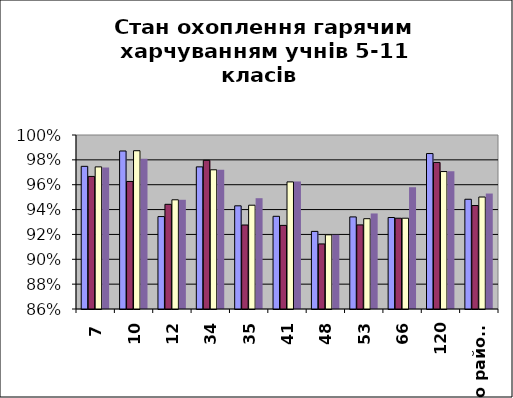
| Category | Series 0 | Series 1 | Series 2 | Series 3 |
|---|---|---|---|---|
| 7 | 0.975 | 0.967 | 0.974 | 0.974 |
| 10 | 0.987 | 0.963 | 0.987 | 0.981 |
| 12 | 0.934 | 0.944 | 0.948 | 0.948 |
| 34 | 0.974 | 0.98 | 0.972 | 0.972 |
| 35 | 0.943 | 0.928 | 0.944 | 0.949 |
| 41 | 0.935 | 0.927 | 0.962 | 0.963 |
| 48 | 0.922 | 0.912 | 0.92 | 0.92 |
| 53 | 0.934 | 0.928 | 0.933 | 0.937 |
| 66 | 0.934 | 0.933 | 0.933 | 0.958 |
| 120 | 0.985 | 0.978 | 0.971 | 0.971 |
| по району | 0.948 | 0.943 | 0.95 | 0.953 |